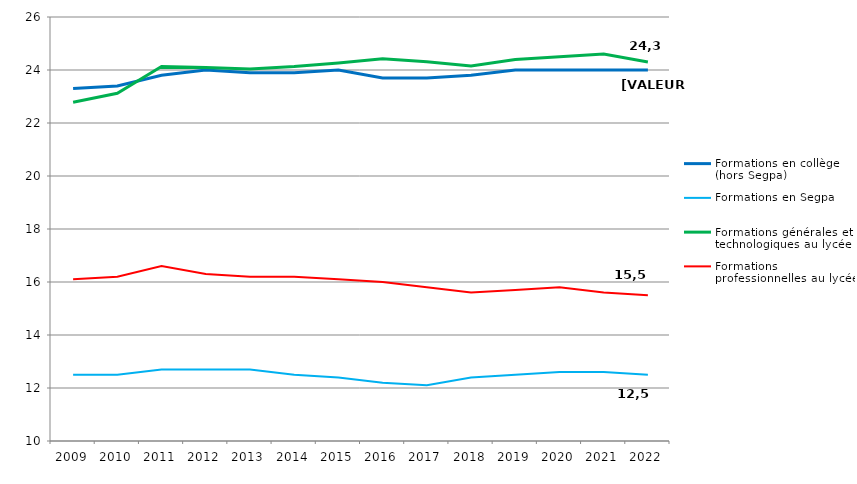
| Category | Formations en collège (hors Segpa) | Formations en Segpa | Formations générales et technologiques au lycée | Formations professionnelles au lycée |
|---|---|---|---|---|
| 2009.0 | 23.3 | 12.5 | 22.78 | 16.1 |
| 2010.0 | 23.4 | 12.5 | 23.12 | 16.2 |
| 2011.0 | 23.8 | 12.7 | 24.13 | 16.6 |
| 2012.0 | 24 | 12.7 | 24.09 | 16.3 |
| 2013.0 | 23.9 | 12.7 | 24.04 | 16.2 |
| 2014.0 | 23.9 | 12.5 | 24.13 | 16.2 |
| 2015.0 | 24 | 12.4 | 24.26 | 16.1 |
| 2016.0 | 23.7 | 12.2 | 24.42 | 16 |
| 2017.0 | 23.7 | 12.1 | 24.31 | 15.8 |
| 2018.0 | 23.8 | 12.4 | 24.15 | 15.6 |
| 2019.0 | 24 | 12.5 | 24.4 | 15.7 |
| 2020.0 | 24 | 12.6 | 24.5 | 15.8 |
| 2021.0 | 24 | 12.6 | 24.6 | 15.6 |
| 2022.0 | 24 | 12.5 | 24.3 | 15.5 |